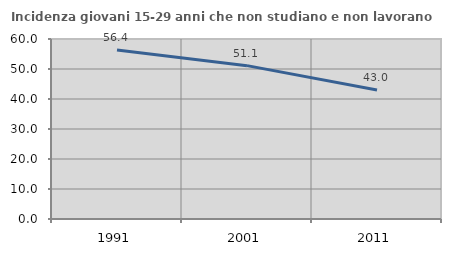
| Category | Incidenza giovani 15-29 anni che non studiano e non lavorano  |
|---|---|
| 1991.0 | 56.364 |
| 2001.0 | 51.12 |
| 2011.0 | 42.998 |